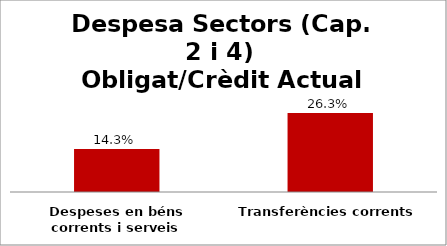
| Category | Series 0 |
|---|---|
| Despeses en béns corrents i serveis | 0.143 |
| Transferències corrents | 0.263 |